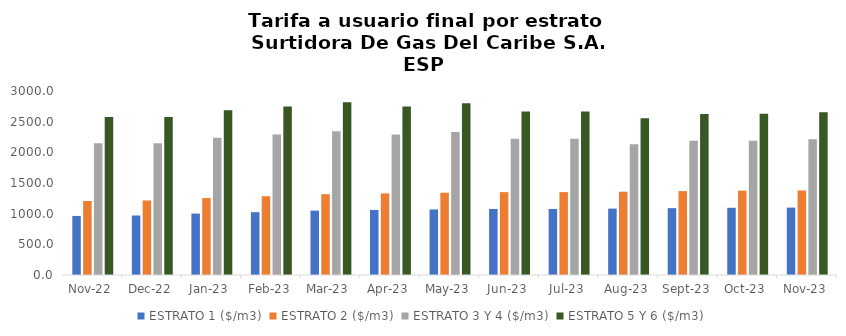
| Category | ESTRATO 1 ($/m3) | ESTRATO 2 ($/m3) | ESTRATO 3 Y 4 ($/m3) | ESTRATO 5 Y 6 ($/m3) |
|---|---|---|---|---|
| 2022-11-01 | 962.82 | 1206.32 | 2147.73 | 2577.276 |
| 2022-12-01 | 970.22 | 1215.6 | 2146.46 | 2575.752 |
| 2023-01-01 | 1001.38 | 1254.3 | 2238.4 | 2686.08 |
| 2023-02-01 | 1024.53 | 1284.4 | 2288.91 | 2746.692 |
| 2023-03-01 | 1049.77 | 1317.27 | 2345.6 | 2814.72 |
| 2023-04-01 | 1060.8 | 1331.1 | 2289.32 | 2747.184 |
| 2023-05-01 | 1069.09 | 1341.51 | 2332.27 | 2798.724 |
| 2023-06-01 | 1076.98 | 1351.41 | 2221.89 | 2666.268 |
| 2023-07-01 | 1076.98 | 1351.41 | 2221.89 | 2666.268 |
| 2023-08-01 | 1082.37 | 1358.18 | 2129.89 | 2555.868 |
| 2023-09-01 | 1089.94 | 1367.67 | 2187.17 | 2624.604 |
| 2023-10-01 | 1095.74 | 1374.95 | 2190.44 | 2628.528 |
| 2023-11-01 | 1098.48 | 1378.38 | 2212.27 | 2654.724 |